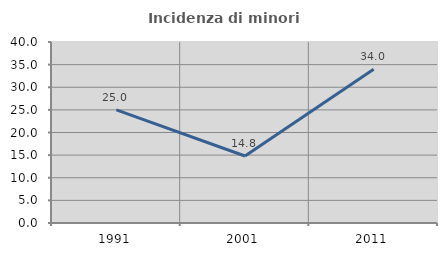
| Category | Incidenza di minori stranieri |
|---|---|
| 1991.0 | 25 |
| 2001.0 | 14.815 |
| 2011.0 | 33.962 |